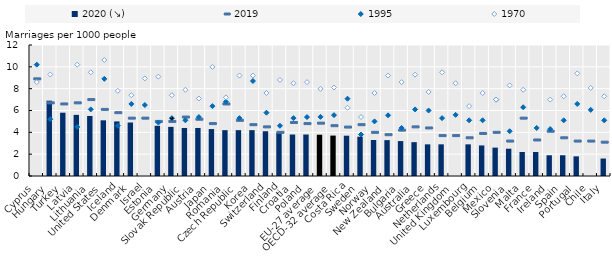
| Category | 2020 (↘) |
|---|---|
| Cyprus | 0 |
| Hungary | 6.9 |
| Turkey | 5.8 |
| Latvia | 5.6 |
| Lithuania | 5.5 |
| United States | 5.1 |
| Iceland | 5 |
| Denmark | 4.9 |
| Israel | 0 |
| Estonia | 4.6 |
| Germany | 4.5 |
| Slovak Republic | 4.4 |
| Austria | 4.4 |
| Japan | 4.3 |
| Romania | 4.2 |
| Czech Republic | 4.2 |
| Korea | 4.2 |
| Switzerland | 4.1 |
| Finland | 4 |
| Croatia | 3.8 |
| Poland | 3.8 |
| EU-27 average | 3.781 |
| OECD-32 average | 3.702 |
| Costa Rica | 3.693 |
| Sweden | 3.6 |
| Norway | 3.3 |
| New Zealand | 3.286 |
| Bulgaria | 3.2 |
| Australia | 3.1 |
| Greece | 2.9 |
| Netherlands | 2.9 |
| United Kingdom | 0 |
| Luxembourg | 2.9 |
| Belgium | 2.8 |
| Mexico | 2.6 |
| Slovenia | 2.5 |
| Malta | 2.2 |
| France | 2.2 |
| Ireland | 1.9 |
| Spain | 1.9 |
| Portugal | 1.8 |
| Chile | 0 |
| Italy | 1.6 |